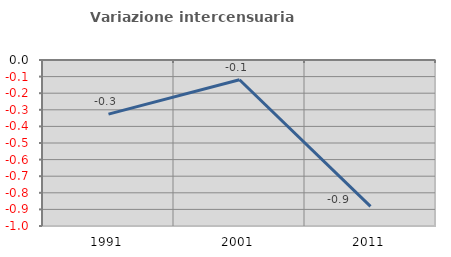
| Category | Variazione intercensuaria annua |
|---|---|
| 1991.0 | -0.326 |
| 2001.0 | -0.119 |
| 2011.0 | -0.882 |